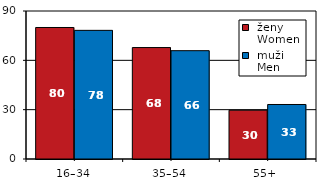
| Category |  ženy 
 Women |  muži 
 Men |
|---|---|---|
| 16–34 | 79.968 | 78.233 |
| 35–54 | 67.767 | 65.872 |
| 55+  | 29.669 | 33.145 |